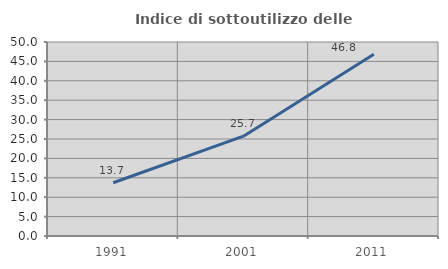
| Category | Indice di sottoutilizzo delle abitazioni  |
|---|---|
| 1991.0 | 13.732 |
| 2001.0 | 25.719 |
| 2011.0 | 46.847 |